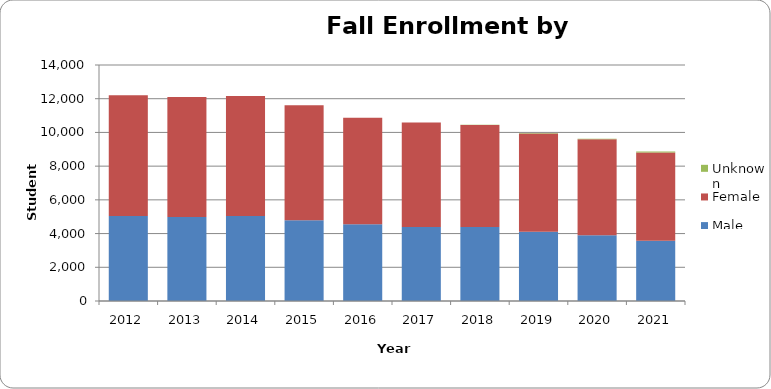
| Category | Male | Female | Unknown |
|---|---|---|---|
| 2012.0 | 5040 | 7160 | 0 |
| 2013.0 | 4990 | 7118 | 0 |
| 2014.0 | 5040 | 7121 | 0 |
| 2015.0 | 4790 | 6822 | 0 |
| 2016.0 | 4552 | 6320 | 0 |
| 2017.0 | 4396 | 6193 | 1 |
| 2018.0 | 4385 | 6054 | 22 |
| 2019.0 | 4115 | 5826 | 20 |
| 2020.0 | 3896 | 5692 | 42 |
| 2021.0 | 3580 | 5227 | 59 |